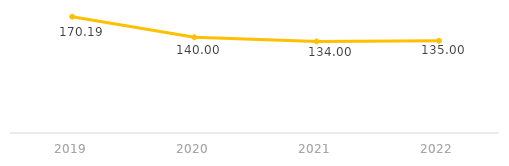
| Category | Tiempo promedio de desplazamiento en autobús |
|---|---|
| 2019.0 | 170.19 |
| 2020.0 | 140 |
| 2021.0 | 134 |
| 2022.0 | 135 |